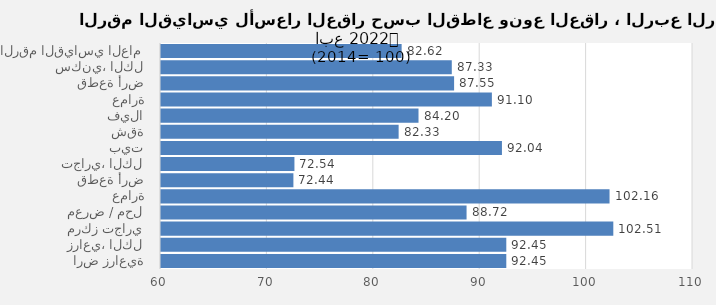
| Category | 2022 |
|---|---|
| الرقم القياسي العام | 82.616 |
| سكني، الكل | 87.33 |
| قطعة أرض | 87.547 |
| عمارة | 91.098 |
| فيلا | 84.202 |
| شقة | 82.334 |
| بيت | 92.043 |
| تجاري، الكل | 72.541 |
| قطعة أرض | 72.444 |
| عمارة | 102.156 |
| معرض / محل | 88.719 |
| مركز تجاري | 102.51 |
| زراعي، الكل | 92.453 |
| ارض زراعية | 92.453 |